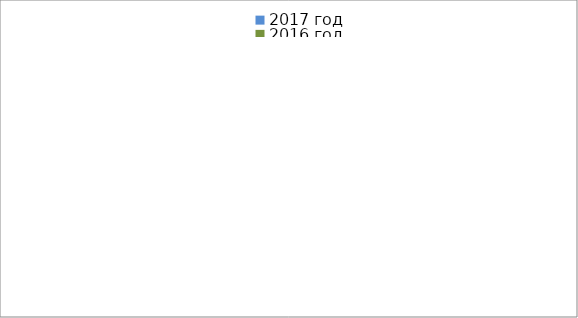
| Category | 2017 год | 2016 год |
|---|---|---|
|  - поджог | 0 | 3 |
|  - неосторожное обращение с огнём | 1 | 0 |
|  - НПТЭ электрооборудования | 2 | 1 |
|  - НПУ и Э печей | 16 | 10 |
|  - НПУ и Э транспортных средств | 6 | 13 |
|   -Шалость с огнем детей | 0 | 0 |
|  -НППБ при эксплуатации эл.приборов | 9 | 8 |
|  - курение | 7 | 1 |
| - прочие | 10 | 13 |
| - не установленные причины | 0 | 0 |